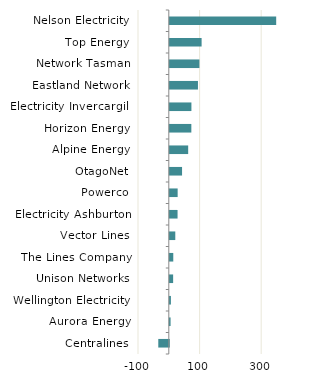
| Category | Series 0 |
|---|---|
| Nelson Electricity | 345.424 |
| Top Energy | 103.287 |
| Network Tasman | 96.156 |
| Eastland Network | 91.412 |
| Electricity Invercargill | 70.174 |
| Horizon Energy | 69.939 |
| Alpine Energy | 59.67 |
| OtagoNet | 39.798 |
| Powerco | 25.497 |
| Electricity Ashburton | 25.204 |
| Vector Lines | 17.828 |
| The Lines Company | 11.277 |
| Unison Networks | 10.829 |
| Wellington Electricity | 3.588 |
| Aurora Energy | 2.514 |
| Centralines | -34.159 |